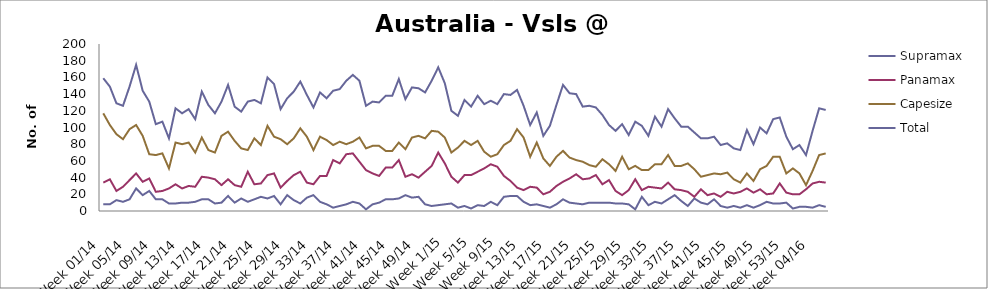
| Category | Supramax | Panamax | Capesize | Total |
|---|---|---|---|---|
| Week 01/14 | 8 | 34 | 117 | 159 |
| Week 02/14 | 8 | 38 | 103 | 149 |
| Week 03/14 | 13 | 24 | 92 | 129 |
| Week 04/14 | 11 | 29 | 86 | 126 |
| Week 05/14 | 14 | 37 | 98 | 149 |
| Week 06/14 | 27 | 45 | 103 | 175 |
| Week 07/14 | 19 | 35 | 90 | 144 |
| Week 08/14 | 24 | 39 | 68 | 131 |
| Week 09/14 | 14 | 23 | 67 | 104 |
| Week 10/14 | 14 | 24 | 69 | 107 |
| Week 11/14 | 9 | 27 | 51 | 87 |
| Week 12/14 | 9 | 32 | 82 | 123 |
| Week 13/14 | 10 | 27 | 80 | 117 |
| Week 14/14 | 10 | 30 | 82 | 122 |
| Week 15/14 | 11 | 29 | 70 | 110 |
| Week 16/14 | 14 | 41 | 88 | 143 |
| Week 17/14 | 14 | 40 | 73 | 127 |
| Week 18/14 | 9 | 38 | 70 | 117 |
| Week 19/14 | 10 | 31 | 90 | 131 |
| Week 20/14 | 18 | 38 | 95 | 151 |
| Week 21/14 | 10 | 31 | 84 | 125 |
| Week 22/14 | 15 | 29 | 75 | 119 |
| Week 23/14 | 11 | 47 | 73 | 131 |
| Week 24/14 | 14 | 32 | 87 | 133 |
| Week 25/14 | 17 | 33 | 79 | 129 |
| Week 26/14 | 15 | 43 | 102 | 160 |
| Week 27/14 | 18 | 45 | 89 | 152 |
| Week 28/14 | 8 | 28 | 86 | 122 |
| Week 29/14 | 19 | 36 | 80 | 135 |
| Week 30/14 | 13 | 43 | 87 | 143 |
| Week 31/14 | 9 | 47 | 99 | 155 |
| Week 32/14 | 16 | 34 | 89 | 139 |
| Week 33/14 | 19 | 32 | 73 | 124 |
| Week 34/14 | 11 | 42 | 89 | 142 |
| Week 35/14 | 8 | 42 | 85 | 135 |
| Week 36/14 | 4 | 61 | 79 | 144 |
| Week 37/14 | 6 | 57 | 83 | 146 |
| Week 38/14 | 8 | 68 | 80 | 156 |
| Week 39/14 | 11 | 69 | 83 | 163 |
| Week 40/14 | 9 | 59 | 88 | 156 |
| Week 41/14 | 2 | 49 | 75 | 126 |
| Week 42/14 | 8 | 45 | 78 | 131 |
| Week 43/14 | 10 | 42 | 78 | 130 |
| Week 44/14 | 14 | 52 | 72 | 138 |
| Week 45/14 | 14 | 52 | 72 | 138 |
| Week 46/14 | 15 | 61 | 82 | 158 |
| Week 47/14 | 19 | 41 | 74 | 134 |
| Week 48/14 | 16 | 44 | 88 | 148 |
| Week 49/14 | 17 | 40 | 90 | 147 |
| Week 50/14 | 8 | 47 | 87 | 142 |
| Week 51/14 | 6 | 54 | 96 | 156 |
| Week 52/14 | 7 | 70 | 95 | 172 |
| Week 1/15 | 8 | 57 | 88 | 153 |
| Week 2/15 | 9 | 41 | 70 | 120 |
| Week 3/15 | 4 | 34 | 76 | 114 |
| Week 4/15 | 6 | 43 | 84 | 133 |
| Week 5/15 | 3 | 43 | 79 | 125 |
| Week 6/15 | 7 | 47 | 84 | 138 |
| Week 7/15 | 6 | 51 | 71 | 128 |
| Week 8/15 | 11 | 56 | 65 | 132 |
| Week 9/15 | 7 | 53 | 68 | 128 |
| Week 10/15 | 17 | 42 | 79 | 140 |
| Week 11/15 | 18 | 36 | 84 | 139 |
| Week 12/15 | 18 | 28 | 98 | 145 |
| Week 13/15 | 11 | 25 | 88 | 126 |
| Week 14/15 | 7 | 29 | 65 | 103 |
| Week 15/15 | 8 | 28 | 82 | 118 |
| Week 16/15 | 6 | 20 | 63 | 90 |
| Week 17/15 | 4 | 23 | 54 | 102 |
| Week 18/15 | 8 | 30 | 65 | 127 |
| Week 19/15 | 14 | 35 | 72 | 151 |
| Week 20/15 | 10 | 39 | 64 | 141 |
| Week 21/15 | 9 | 44 | 61 | 140 |
| Week 22/15 | 8 | 38 | 59 | 125 |
| Week 23/15 | 10 | 39 | 55 | 126 |
| Week 24/15 | 10 | 43 | 53 | 124 |
| Week 25/15 | 10 | 32 | 62 | 115 |
| Week 26/15 | 10 | 37 | 56 | 103 |
| Week 27/15 | 9 | 24 | 48 | 96 |
| Week 28/15 | 9 | 19 | 65 | 104 |
| Week 29/15 | 8 | 25 | 50 | 91 |
| Week 30/15 | 2 | 38 | 54 | 107 |
| Week 31/15 | 17 | 25 | 49 | 102 |
| Week 32/15 | 7 | 29 | 49 | 90 |
| Week 33/15 | 11 | 28 | 56 | 113 |
| Week 34/15 | 9 | 27 | 56 | 101 |
| Week 35/15 | 14 | 34 | 67 | 122 |
| Week 36/15 | 19 | 26 | 54 | 111 |
| Week 37/15 | 12 | 25 | 54 | 101 |
| Week 38/15 | 6 | 23 | 57 | 101 |
| Week 39/15 | 15 | 17 | 50 | 94 |
| Week 40/15 | 10 | 26 | 41 | 87 |
| Week 41/15 | 8 | 19 | 43 | 87 |
| Week 42/15 | 14 | 21 | 45 | 89 |
| Week 43/15 | 6 | 17 | 44 | 79 |
| Week 44/15 | 4 | 23 | 46 | 81 |
| Week 45/15 | 6 | 21 | 38 | 75 |
| Week 46/15 | 4 | 23 | 34 | 73 |
| Week 47/15 | 7 | 27 | 45 | 97 |
| Week 48/15 | 4 | 22 | 36 | 80 |
| Week 49/15 | 7 | 26 | 50 | 100 |
| Week 50/15 | 11 | 20 | 54 | 93 |
| Week 51/15 | 9 | 21 | 65 | 110 |
| Week 52/15 | 9 | 33 | 65 | 112 |
| Week 53/15 | 10 | 22 | 45 | 89 |
| Week 01/16 | 3 | 20 | 51 | 74 |
| Week 02/16 | 5 | 20 | 45 | 79 |
| Week 03/16 | 5 | 26 | 31 | 67 |
| Week 04/16 | 4 | 33 | 48 | 96 |
| Week 05/16 | 7 | 35 | 67 | 123 |
| Week 06/16 | 5 | 34 | 69 | 121 |